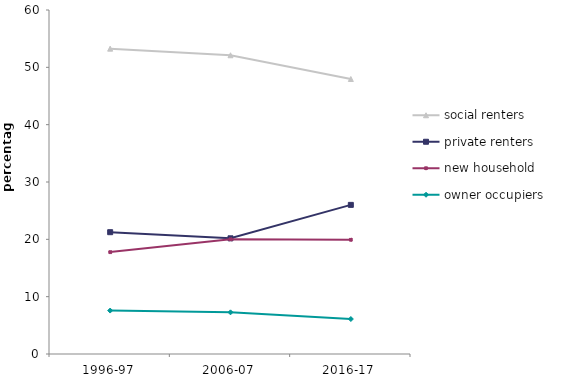
| Category | social renters | private renters | new household | owner occupiers |
|---|---|---|---|---|
| 1996-97 | 53.26 | 21.244 | 17.771 | 7.575 |
| 2006-07 | 52.107 | 20.175 | 20.007 | 7.267 |
| 2016-17 | 47.963 | 26.009 | 19.927 | 6.102 |